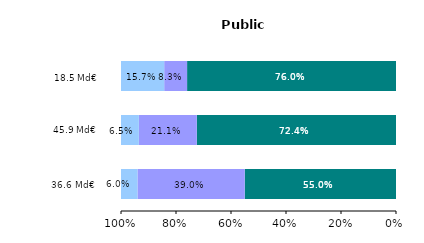
| Category | État (1) | Collectivités territoriales | Autres (2) |
|---|---|---|---|
| Écoles du premier degré
(maternelles et élémentaires) | 0.55 | 0.39 | 0.06 |
| Établissements du second degré (3)
(collèges et lycées) | 0.724 | 0.211 | 0.065 |
| Établissements du supérieur | 0.76 | 0.083 | 0.157 |